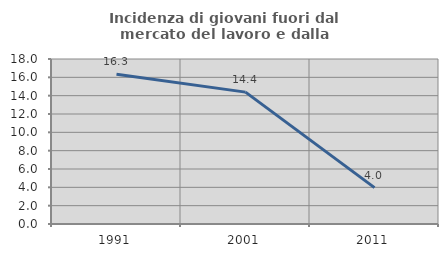
| Category | Incidenza di giovani fuori dal mercato del lavoro e dalla formazione  |
|---|---|
| 1991.0 | 16.34 |
| 2001.0 | 14.386 |
| 2011.0 | 3.968 |